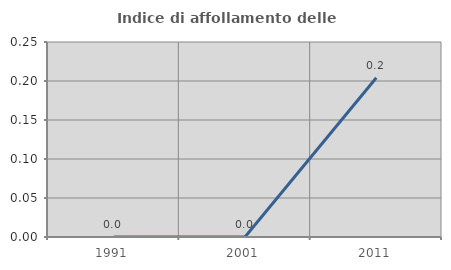
| Category | Indice di affollamento delle abitazioni  |
|---|---|
| 1991.0 | 0 |
| 2001.0 | 0 |
| 2011.0 | 0.204 |